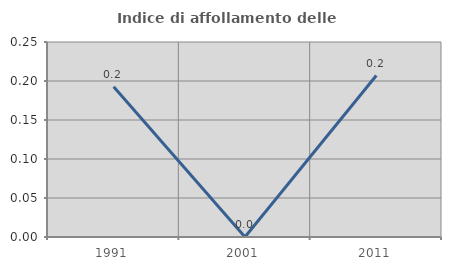
| Category | Indice di affollamento delle abitazioni  |
|---|---|
| 1991.0 | 0.193 |
| 2001.0 | 0 |
| 2011.0 | 0.207 |